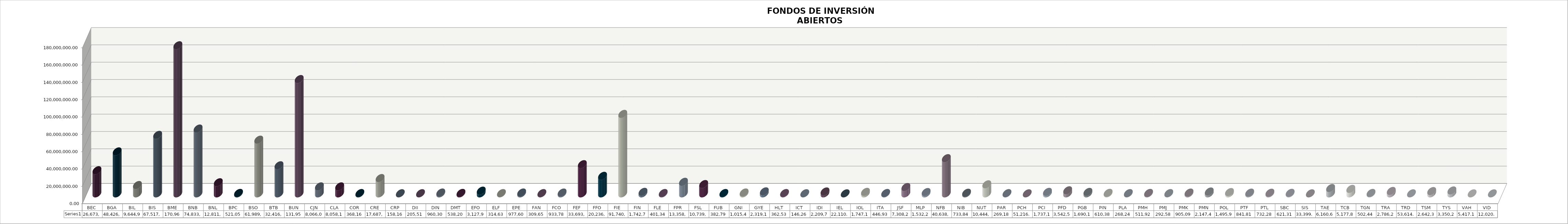
| Category | Series 0 |
|---|---|
| BEC | 26673955.77 |
| BGA | 48426991.73 |
| BIL | 9644917.68 |
| BIS | 67517010.51 |
| BME | 170967392.64 |
| BNB | 74833711.64 |
| BNL | 12811768.56 |
| BPC | 521054.3 |
| BSO | 61989710.34 |
| BTB | 32416077.81 |
| BUN | 131959390.49 |
| CJN | 8066073.99 |
| CLA | 8058130.22 |
| COR | 368169.93 |
| CRE | 17687312.81 |
| CRP | 158169.1 |
| DII | 205514.38 |
| DIN | 960302.77 |
| DMT | 538209.64 |
| EFO | 3127919.97 |
| ELF | 314637.75 |
| EPE | 977603.59 |
| FAN | 309655.98 |
| FCO | 933786.02 |
| FEF | 33693708.84 |
| FFO | 20236854.28 |
| FIE | 91740027.65 |
| FIN | 1742751.87 |
| FLE | 401345.86 |
| FPR | 13358838.71 |
| FSL | 10739545.71 |
| FUB | 382794.07 |
| GNI | 1015422.5 |
| GYE | 2319165.72 |
| HLT | 362534.27 |
| ICT | 146265.72 |
| IDI | 2209724.14 |
| IEL | 22110.96 |
| IOL | 1747183.77 |
| ITA | 446934.84 |
| JSF | 7308286.71 |
| MLP | 1532256.69 |
| NFB | 40638518.03 |
| NIB | 733849.36 |
| NUT | 10444884.36 |
| PAR | 269188.17 |
| PCH | 51216.7 |
| PCI | 1737136.51 |
| PFD | 3542559.32 |
| PGB | 1690108.46 |
| PIN | 610380 |
| PLA | 268242.59 |
| PMH | 511927.7 |
| PMJ | 292580.76 |
| PMK | 905098.85 |
| PMN | 2147462.82 |
| POL | 1495941.34 |
| PTF | 841811.97 |
| PTL | 732281.34 |
| SBC | 621313.91 |
| SIS | 33399.27 |
| TAE | 6160637.8 |
| TCB | 5177848.16 |
| TGN | 502449.58 |
| TRA | 2786255.22 |
| TRD | 53614.93 |
| TSM | 2642360.48 |
| TYS | 3350251.7 |
| VAH | 5417.14 |
| VID | 12020.4 |